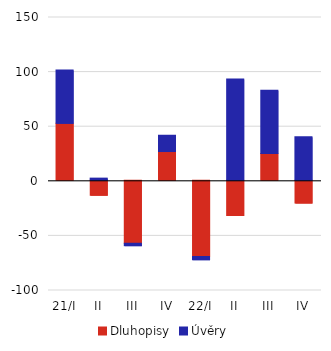
| Category | Dluhopisy | Úvěry |
|---|---|---|
| 21/I | 52.335 | 48.708 |
| II | -13.668 | 1.987 |
| III | -57.657 | -2.213 |
| IV | 26.344 | 14.945 |
| 22/I | -69.811 | -2.889 |
| II | -32.139 | 92.776 |
| III | 24.501 | 57.866 |
| IV | -20.86 | 39.805 |